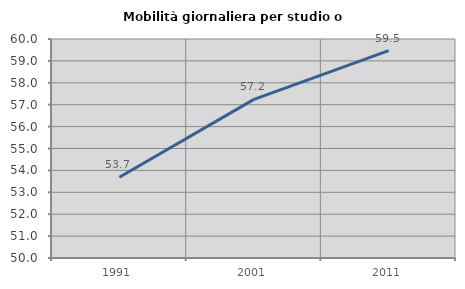
| Category | Mobilità giornaliera per studio o lavoro |
|---|---|
| 1991.0 | 53.684 |
| 2001.0 | 57.241 |
| 2011.0 | 59.471 |